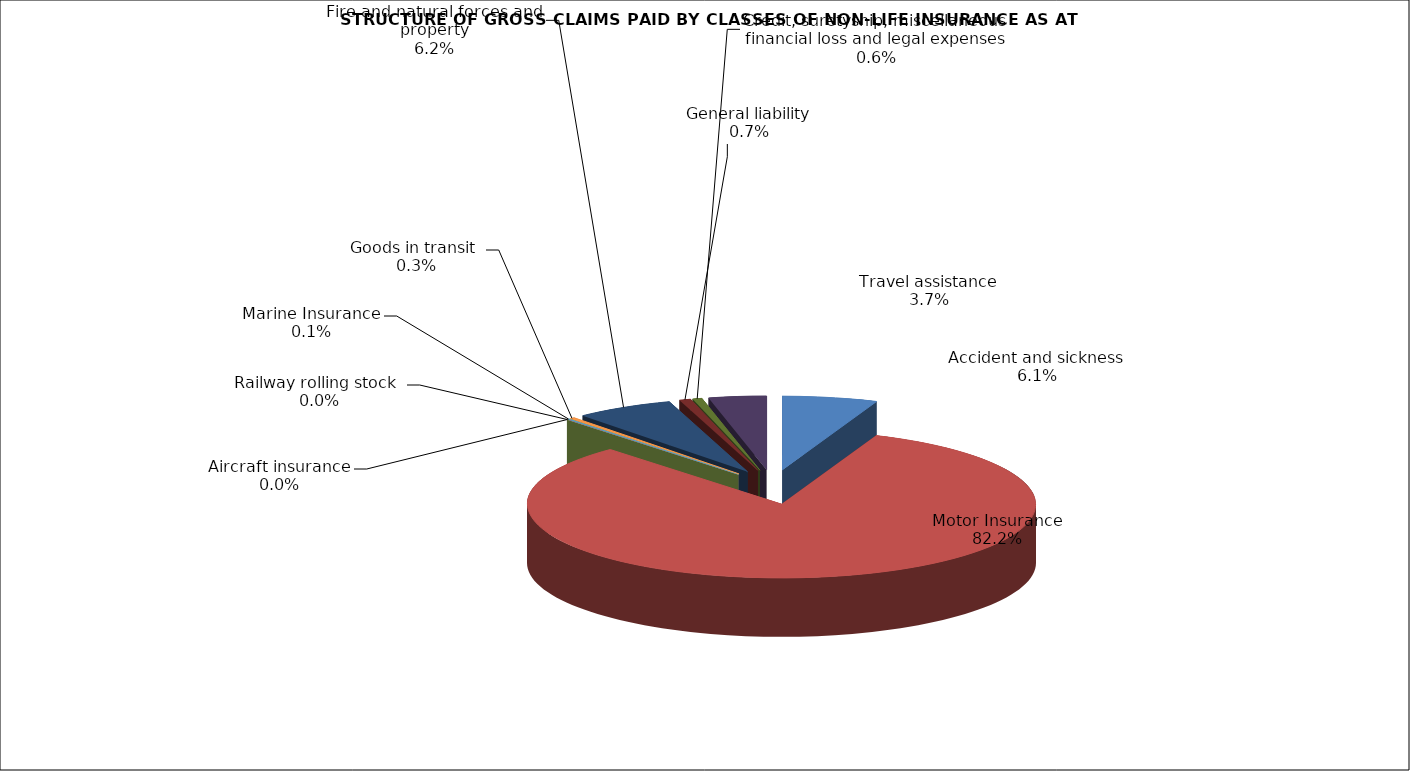
| Category | Accident and sickness |
|---|---|
| Accident and sickness | 0.061 |
| Motor Insurance | 0.822 |
| Railway rolling stock  | 0 |
| Aircraft insurance | 0 |
| Marine Insurance | 0.001 |
| Goods in transit  | 0.003 |
| Fire and natural forces and property | 0.062 |
| General liability | 0.007 |
| Credit, suretyship, miscellaneous financial loss and legal expenses | 0.006 |
| Travel assistance | 0.037 |